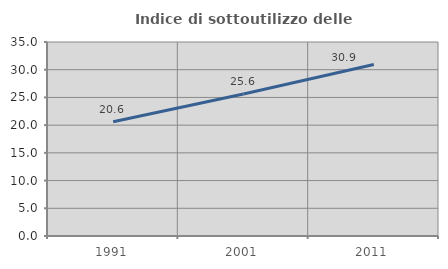
| Category | Indice di sottoutilizzo delle abitazioni  |
|---|---|
| 1991.0 | 20.619 |
| 2001.0 | 25.627 |
| 2011.0 | 30.926 |